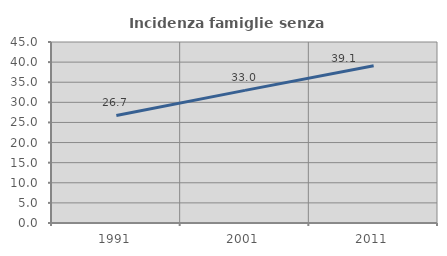
| Category | Incidenza famiglie senza nuclei |
|---|---|
| 1991.0 | 26.747 |
| 2001.0 | 32.97 |
| 2011.0 | 39.096 |